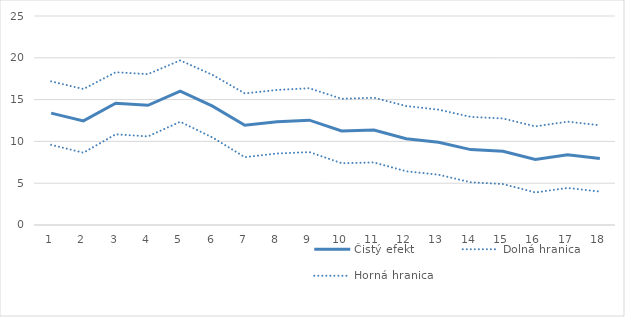
| Category | Čistý efekt | Dolná hranica | Horná hranica |
|---|---|---|---|
| 1.0 | 13.386 | 9.589 | 17.182 |
| 2.0 | 12.455 | 8.646 | 16.265 |
| 3.0 | 14.561 | 10.849 | 18.273 |
| 4.0 | 14.321 | 10.597 | 18.046 |
| 5.0 | 16.018 | 12.346 | 19.69 |
| 6.0 | 14.212 | 10.47 | 17.953 |
| 7.0 | 11.926 | 8.113 | 15.74 |
| 8.0 | 12.354 | 8.551 | 16.157 |
| 9.0 | 12.542 | 8.722 | 16.362 |
| 10.0 | 11.245 | 7.391 | 15.099 |
| 11.0 | 11.352 | 7.482 | 15.222 |
| 12.0 | 10.329 | 6.426 | 14.232 |
| 13.0 | 9.908 | 6.019 | 13.797 |
| 14.0 | 9.02 | 5.107 | 12.933 |
| 15.0 | 8.821 | 4.9 | 12.742 |
| 16.0 | 7.842 | 3.889 | 11.795 |
| 17.0 | 8.397 | 4.435 | 12.36 |
| 18.0 | 7.96 | 3.994 | 11.926 |